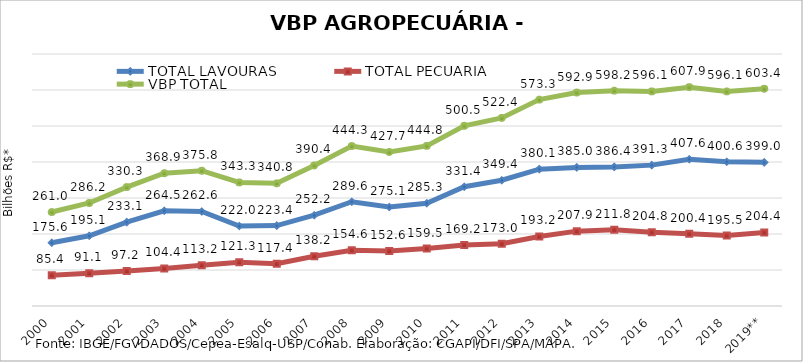
| Category | TOTAL LAVOURAS | TOTAL PECUÁRIA | VBP TOTAL |
|---|---|---|---|
| 2000 | 175.634 | 85.374 | 261.008 |
| 2001 | 195.097 | 91.083 | 286.18 |
| 2002 | 233.05 | 97.232 | 330.282 |
| 2003 | 264.51 | 104.362 | 368.872 |
| 2004 | 262.574 | 113.202 | 375.776 |
| 2005 | 221.994 | 121.267 | 343.262 |
| 2006 | 223.35 | 117.449 | 340.799 |
| 2007 | 252.234 | 138.172 | 390.406 |
| 2008 | 289.626 | 154.648 | 444.274 |
| 2009 | 275.107 | 152.636 | 427.743 |
| 2010 | 285.316 | 159.475 | 444.791 |
| 2011 | 331.359 | 169.162 | 500.522 |
| 2012 | 349.378 | 173.043 | 522.421 |
| 2013 | 380.126 | 193.182 | 573.307 |
| 2014 | 385.017 | 207.918 | 592.935 |
| 2015 | 386.414 | 211.812 | 598.226 |
| 2016 | 391.3 | 204.769 | 596.069 |
| 2017 | 407.558 | 200.369 | 607.927 |
| 2018 | 400.59 | 195.523 | 596.113 |
| 2019** | 399.023 | 204.356 | 603.379 |